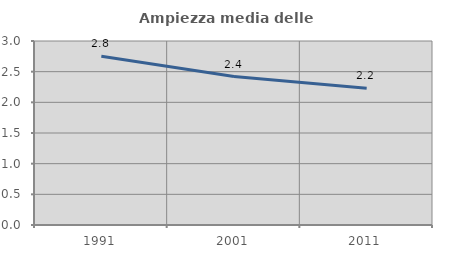
| Category | Ampiezza media delle famiglie |
|---|---|
| 1991.0 | 2.752 |
| 2001.0 | 2.42 |
| 2011.0 | 2.23 |